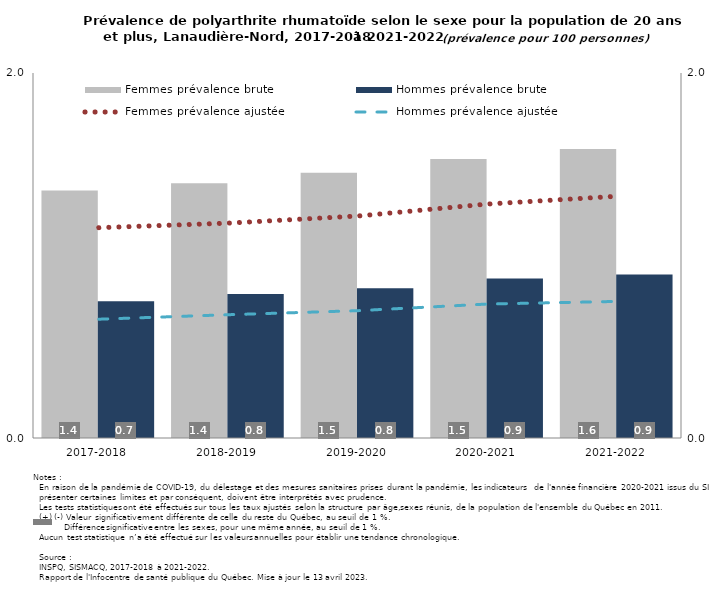
| Category | Femmes prévalence brute | Hommes prévalence brute |
|---|---|---|
| 2017-2018 | 1.356 | 0.75 |
| 2018-2019 | 1.396 | 0.79 |
| 2019-2020 | 1.453 | 0.821 |
| 2020-2021 | 1.529 | 0.874 |
| 2021-2022 | 1.583 | 0.896 |